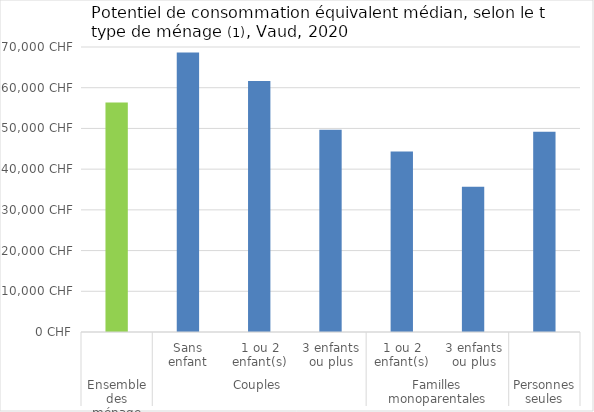
| Category | 2020 |
|---|---|
| 0 | 56343 |
| 1 | 68665 |
| 2 | 61648 |
| 3 | 49698 |
| 4 | 44322.5 |
| 5 | 35690.5 |
| 6 | 49163 |